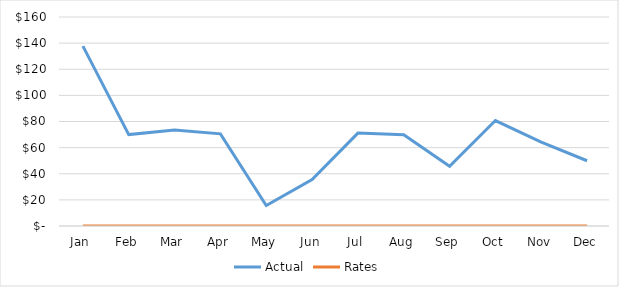
| Category | Actual | Rates |
|---|---|---|
| Jan | 137.737 | 0 |
| Feb | 69.973 | 0 |
| Mar | 73.578 | 0 |
| Apr | 70.532 | 0 |
| May | 15.686 | 0 |
| Jun | 35.544 | 0 |
| Jul | 71.131 | 0 |
| Aug | 69.79 | 0 |
| Sep | 45.709 | 0 |
| Oct | 80.722 | 0 |
| Nov | 64.186 | 0 |
| Dec | 49.963 | 0 |